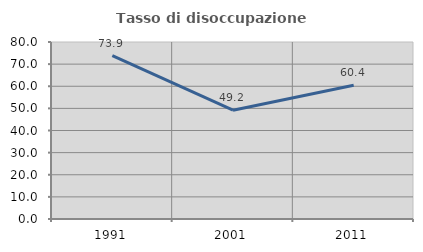
| Category | Tasso di disoccupazione giovanile  |
|---|---|
| 1991.0 | 73.878 |
| 2001.0 | 49.18 |
| 2011.0 | 60.417 |